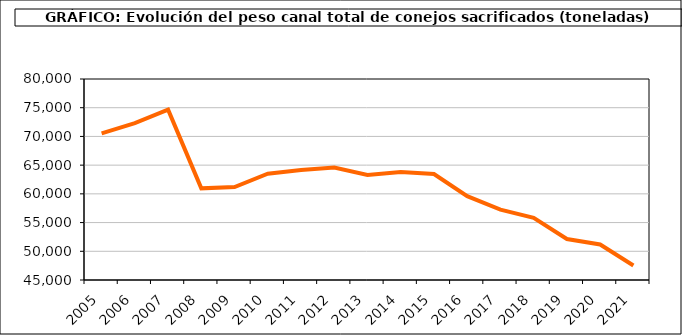
| Category | Peso canal |
|---|---|
| 2005.0 | 70523.95 |
| 2006.0 | 72307.553 |
| 2007.0 | 74666.407 |
| 2008.0 | 60960.313 |
| 2009.0 | 61195.132 |
| 2010.0 | 63505.334 |
| 2011.0 | 64139.488 |
| 2012.0 | 64578.018 |
| 2013.0 | 63288.914 |
| 2014.0 | 63789.699 |
| 2015.0 | 63460.686 |
| 2016.0 | 59589.334 |
| 2017.0 | 57257.988 |
| 2018.0 | 55823.653 |
| 2019.0 | 52143.325 |
| 2020.0 | 51181.242 |
| 2021.0 | 47520.654 |